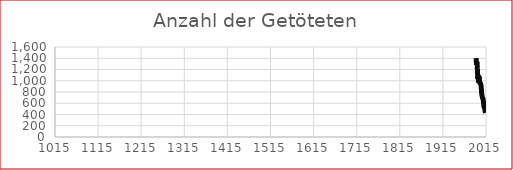
| Category | Getötete |
|---|---|
| 1992.0 | 1403 |
| 1993.0 | 1283 |
| 1994.0 | 1338 |
| 1995.0 | 1210 |
| 1996.0 | 1027 |
| 1997.0 | 1105 |
| 1998.0 | 963 |
| 1999.0 | 1079 |
| 2000.0 | 976 |
| 2001.0 | 958 |
| 2002.0 | 956 |
| 2003.0 | 931 |
| 2004.0 | 878 |
| 2005.0 | 768 |
| 2006.0 | 730 |
| 2007.0 | 691 |
| 2008.0 | 679 |
| 2009.0 | 633 |
| 2010.0 | 552 |
| 2011.0 | 523 |
| 2012.0 | 531 |
| 2013.0 | 455 |
| 2014.0 | 430 |